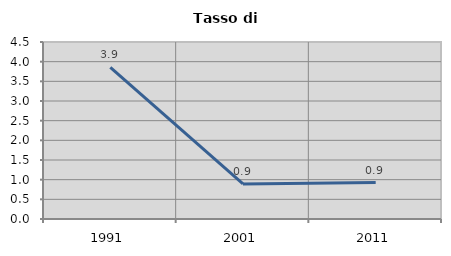
| Category | Tasso di disoccupazione   |
|---|---|
| 1991.0 | 3.854 |
| 2001.0 | 0.891 |
| 2011.0 | 0.928 |